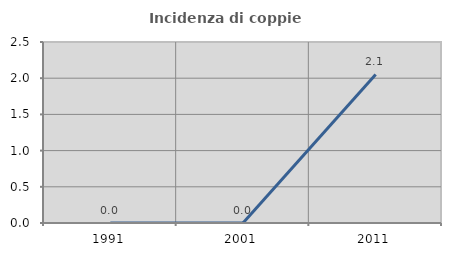
| Category | Incidenza di coppie miste |
|---|---|
| 1991.0 | 0 |
| 2001.0 | 0 |
| 2011.0 | 2.051 |